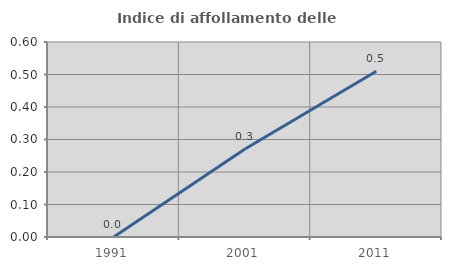
| Category | Indice di affollamento delle abitazioni  |
|---|---|
| 1991.0 | 0 |
| 2001.0 | 0.271 |
| 2011.0 | 0.51 |